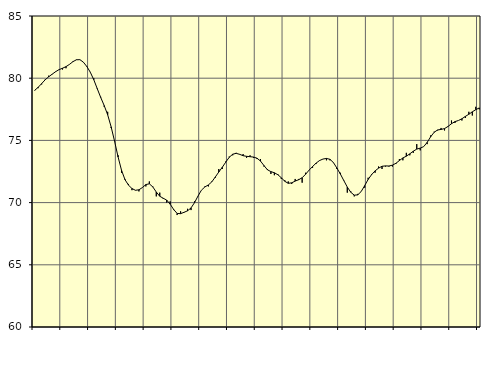
| Category | Piggar | Series 1 |
|---|---|---|
| nan | 79 | 79.03 |
| 87.0 | 79.2 | 79.27 |
| 87.0 | 79.5 | 79.57 |
| 87.0 | 79.9 | 79.87 |
| nan | 80.2 | 80.11 |
| 88.0 | 80.3 | 80.32 |
| 88.0 | 80.5 | 80.52 |
| 88.0 | 80.7 | 80.69 |
| nan | 80.7 | 80.8 |
| 89.0 | 80.8 | 80.93 |
| 89.0 | 81.1 | 81.11 |
| 89.0 | 81.3 | 81.33 |
| nan | 81.5 | 81.48 |
| 90.0 | 81.5 | 81.49 |
| 90.0 | 81.3 | 81.29 |
| 90.0 | 80.9 | 80.94 |
| nan | 80.5 | 80.48 |
| 91.0 | 80 | 79.88 |
| 91.0 | 79.2 | 79.16 |
| 91.0 | 78.5 | 78.45 |
| nan | 77.7 | 77.8 |
| 92.0 | 77.3 | 77.06 |
| 92.0 | 76 | 76.09 |
| 92.0 | 75 | 74.92 |
| nan | 73.8 | 73.67 |
| 93.0 | 72.4 | 72.59 |
| 93.0 | 71.9 | 71.84 |
| 93.0 | 71.5 | 71.4 |
| nan | 71 | 71.13 |
| 94.0 | 71 | 70.99 |
| 94.0 | 70.9 | 71.03 |
| 94.0 | 71.2 | 71.21 |
| nan | 71.3 | 71.45 |
| 95.0 | 71.7 | 71.51 |
| 95.0 | 71.3 | 71.26 |
| 95.0 | 70.5 | 70.85 |
| nan | 70.8 | 70.51 |
| 96.0 | 70.3 | 70.35 |
| 96.0 | 70 | 70.2 |
| 96.0 | 70.1 | 69.87 |
| nan | 69.4 | 69.45 |
| 97.0 | 69 | 69.13 |
| 97.0 | 69.3 | 69.11 |
| 97.0 | 69.2 | 69.22 |
| nan | 69.5 | 69.34 |
| 98.0 | 69.4 | 69.57 |
| 98.0 | 70.1 | 69.99 |
| 98.0 | 70.5 | 70.52 |
| nan | 71 | 71 |
| 99.0 | 71.3 | 71.26 |
| 99.0 | 71.3 | 71.42 |
| 99.0 | 71.7 | 71.67 |
| nan | 72 | 72.06 |
| 0.0 | 72.7 | 72.46 |
| 0.0 | 72.7 | 72.84 |
| 0.0 | 73.3 | 73.25 |
| nan | 73.7 | 73.64 |
| 1.0 | 73.8 | 73.89 |
| 1.0 | 74 | 73.96 |
| 1.0 | 73.9 | 73.88 |
| nan | 73.9 | 73.77 |
| 2.0 | 73.6 | 73.72 |
| 2.0 | 73.8 | 73.69 |
| 2.0 | 73.6 | 73.66 |
| nan | 73.5 | 73.57 |
| 3.0 | 73.5 | 73.34 |
| 3.0 | 72.9 | 72.98 |
| 3.0 | 72.7 | 72.64 |
| nan | 72.3 | 72.49 |
| 4.0 | 72.2 | 72.4 |
| 4.0 | 72.3 | 72.24 |
| 4.0 | 71.9 | 72 |
| nan | 71.8 | 71.71 |
| 5.0 | 71.7 | 71.55 |
| 5.0 | 71.5 | 71.59 |
| 5.0 | 71.9 | 71.73 |
| nan | 71.9 | 71.84 |
| 6.0 | 71.6 | 72 |
| 6.0 | 72.4 | 72.28 |
| 6.0 | 72.6 | 72.61 |
| nan | 72.8 | 72.9 |
| 7.0 | 73.1 | 73.17 |
| 7.0 | 73.4 | 73.38 |
| 7.0 | 73.5 | 73.5 |
| nan | 73.4 | 73.55 |
| 8.0 | 73.4 | 73.48 |
| 8.0 | 73.2 | 73.22 |
| 8.0 | 72.7 | 72.78 |
| nan | 72.4 | 72.3 |
| 9.0 | 71.8 | 71.77 |
| 9.0 | 70.8 | 71.25 |
| 9.0 | 70.9 | 70.83 |
| nan | 70.5 | 70.6 |
| 10.0 | 70.7 | 70.62 |
| 10.0 | 70.9 | 70.89 |
| 10.0 | 71.2 | 71.36 |
| nan | 72 | 71.86 |
| 11.0 | 72.3 | 72.25 |
| 11.0 | 72.4 | 72.55 |
| 11.0 | 72.9 | 72.77 |
| nan | 72.7 | 72.92 |
| 12.0 | 72.9 | 72.95 |
| 12.0 | 72.9 | 72.94 |
| 12.0 | 72.9 | 73.01 |
| nan | 73.1 | 73.16 |
| 13.0 | 73.5 | 73.38 |
| 13.0 | 73.4 | 73.59 |
| 13.0 | 74 | 73.73 |
| nan | 73.8 | 73.92 |
| 14.0 | 74 | 74.13 |
| 14.0 | 74.7 | 74.3 |
| 14.0 | 74.2 | 74.38 |
| nan | 74.5 | 74.5 |
| 15.0 | 74.7 | 74.84 |
| 15.0 | 75.4 | 75.29 |
| 15.0 | 75.7 | 75.65 |
| nan | 75.8 | 75.84 |
| 16.0 | 76 | 75.88 |
| 16.0 | 75.8 | 75.95 |
| 16.0 | 76.1 | 76.12 |
| nan | 76.6 | 76.34 |
| 17.0 | 76.4 | 76.51 |
| 17.0 | 76.6 | 76.6 |
| 17.0 | 76.6 | 76.74 |
| nan | 76.8 | 76.93 |
| 18.0 | 77.3 | 77.1 |
| 18.0 | 77 | 77.3 |
| 18.0 | 77.7 | 77.47 |
| nan | 77.5 | 77.61 |